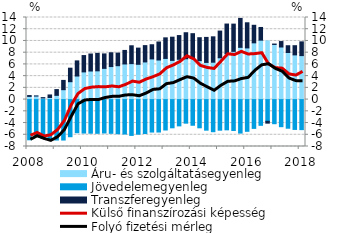
| Category | Áru- és szolgáltatásegyenleg | Jövedelemegyenleg | Transzferegyenleg |
|---|---|---|---|
| 2008.0 | 0.542 | -6.855 | 0.144 |
| 2008.0 | 0.607 | -6.318 | 0.016 |
| 2008.0 | 0.276 | -6.627 | 0.057 |
| 2008.0 | 0.356 | -6.874 | 0.434 |
| 2009.0 | 0.725 | -6.896 | 0.982 |
| 2009.0 | 1.689 | -6.9 | 1.582 |
| 2009.0 | 3.052 | -6.333 | 2.306 |
| 2009.0 | 4.018 | -5.649 | 2.584 |
| 2010.0 | 4.723 | -5.709 | 2.785 |
| 2010.0 | 4.875 | -5.734 | 2.897 |
| 2010.0 | 4.906 | -5.753 | 2.976 |
| 2010.0 | 5.323 | -5.696 | 2.468 |
| 2011.0 | 5.632 | -5.751 | 2.353 |
| 2011.0 | 5.782 | -5.822 | 2.145 |
| 2011.0 | 6.075 | -5.873 | 2.309 |
| 2011.0 | 6.133 | -6.11 | 3.044 |
| 2012.0 | 6.016 | -5.905 | 2.764 |
| 2012.0 | 6.423 | -5.787 | 2.783 |
| 2012.0 | 6.938 | -5.537 | 2.417 |
| 2012.0 | 6.753 | -5.533 | 3.069 |
| 2013.0 | 7.019 | -5.186 | 3.511 |
| 2013.0 | 6.687 | -4.813 | 3.957 |
| 2013.0 | 6.877 | -4.482 | 4.041 |
| 2013.0 | 6.964 | -4.021 | 4.439 |
| 2014.0 | 7.045 | -4.377 | 4.196 |
| 2014.0 | 6.644 | -4.812 | 3.911 |
| 2014.0 | 6.34 | -5.216 | 4.266 |
| 2014.0 | 6.376 | -5.477 | 4.328 |
| 2015.0 | 7.133 | -5.219 | 4.55 |
| 2015.0 | 7.828 | -5.159 | 5.057 |
| 2015.0 | 8.226 | -5.27 | 4.646 |
| 2015.0 | 8.908 | -5.712 | 4.937 |
| 2016.0 | 8.812 | -5.41 | 4.288 |
| 2016.0 | 9.679 | -4.913 | 2.992 |
| 2016.0 | 10.136 | -4.389 | 2.166 |
| 2016.0 | 10.012 | -3.705 | -0.312 |
| 2017.0 | 9.401 | -4.113 | 0.071 |
| 2017.0 | 8.969 | -4.623 | 0.929 |
| 2017.0 | 8.032 | -4.882 | 1.153 |
| 2017.0 | 7.624 | -5.091 | 1.567 |
| 2018.0 | 7.501 | -5.124 | 2.347 |